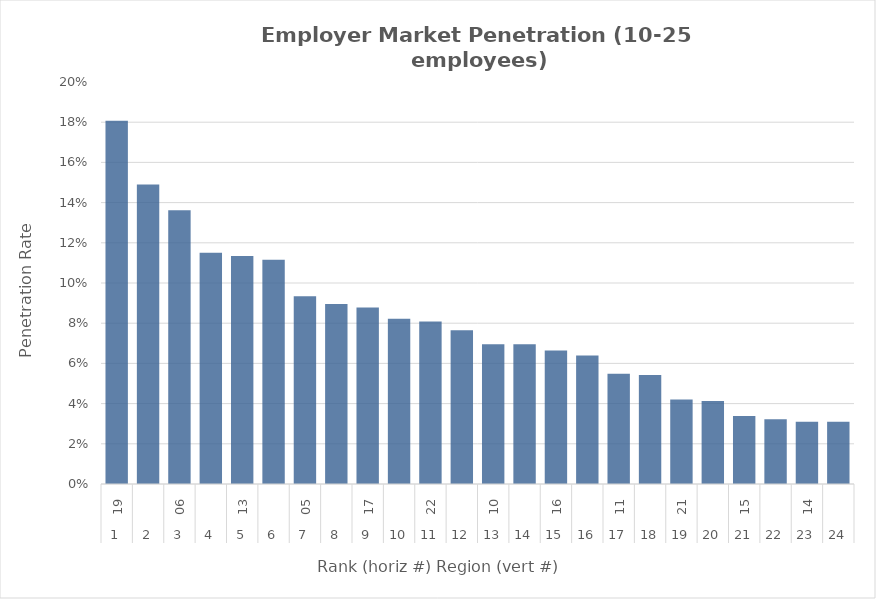
| Category | Rate |
|---|---|
| 0 | 0.181 |
| 1 | 0.149 |
| 2 | 0.136 |
| 3 | 0.115 |
| 4 | 0.113 |
| 5 | 0.112 |
| 6 | 0.093 |
| 7 | 0.09 |
| 8 | 0.088 |
| 9 | 0.082 |
| 10 | 0.081 |
| 11 | 0.076 |
| 12 | 0.07 |
| 13 | 0.069 |
| 14 | 0.066 |
| 15 | 0.064 |
| 16 | 0.055 |
| 17 | 0.054 |
| 18 | 0.042 |
| 19 | 0.041 |
| 20 | 0.034 |
| 21 | 0.032 |
| 22 | 0.031 |
| 23 | 0.031 |